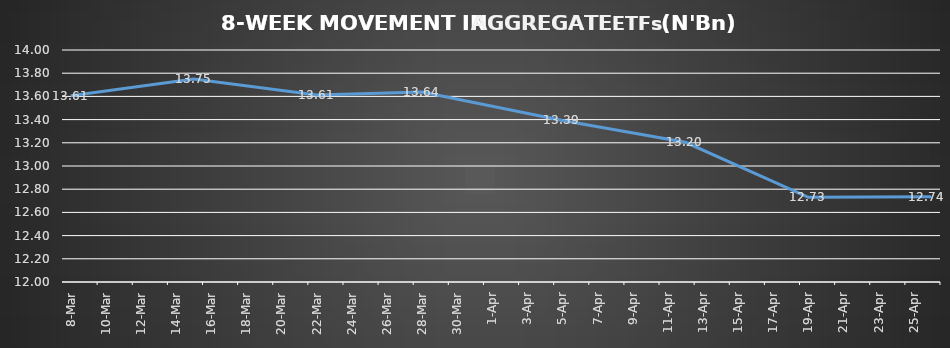
| Category | ETFs AGGREGATE |
|---|---|
| 2024-03-08 | 13.605 |
| 2024-03-15 | 13.75 |
| 2024-03-22 | 13.612 |
| 2024-03-28 | 13.638 |
| 2024-04-05 | 13.392 |
| 2024-04-12 | 13.205 |
| 2024-04-19 | 12.73 |
| 2024-04-26 | 12.735 |